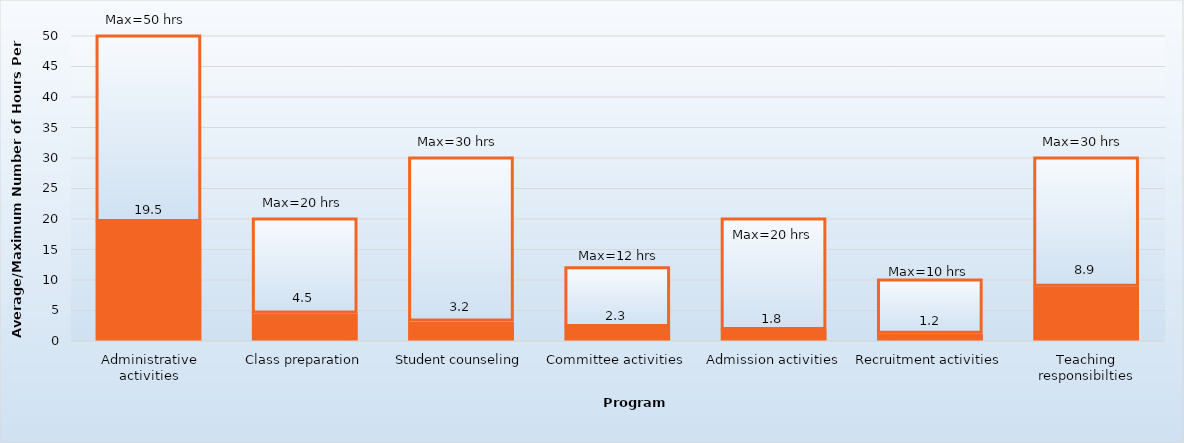
| Category | Average hours per week | Maximum |
|---|---|---|
| Administrative activities | 19.5 | 30.5 |
| Class preparation | 4.5 | 15.5 |
| Student counseling | 3.2 | 26.8 |
| Committee activities | 2.3 | 9.7 |
| Admission activities | 1.8 | 18.2 |
| Recruitment activities | 1.2 | 8.8 |
| Teaching responsibilties | 8.9 | 21.1 |